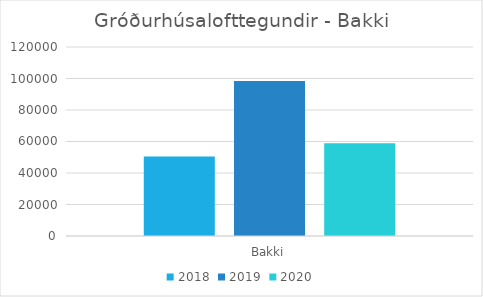
| Category | 2018 | 2019 | 2020 |
|---|---|---|---|
| Bakki | 50402 | 98405 | 58966 |